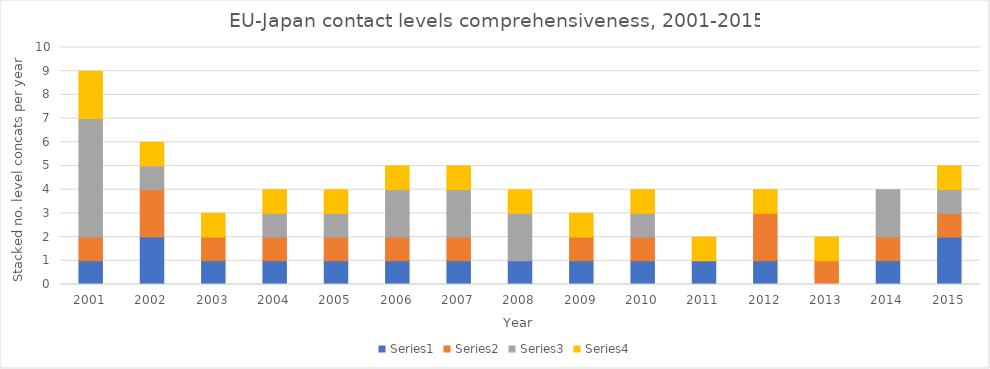
| Category | Series 0 | Series 1 | Series 2 | Series 3 |
|---|---|---|---|---|
| 2001.0 | 1 | 1 | 5 | 2 |
| 2002.0 | 2 | 2 | 1 | 1 |
| 2003.0 | 1 | 1 | 0 | 1 |
| 2004.0 | 1 | 1 | 1 | 1 |
| 2005.0 | 1 | 1 | 1 | 1 |
| 2006.0 | 1 | 1 | 2 | 1 |
| 2007.0 | 1 | 1 | 2 | 1 |
| 2008.0 | 1 | 0 | 2 | 1 |
| 2009.0 | 1 | 1 | 0 | 1 |
| 2010.0 | 1 | 1 | 1 | 1 |
| 2011.0 | 1 | 0 | 0 | 1 |
| 2012.0 | 1 | 2 | 0 | 1 |
| 2013.0 | 0 | 1 | 0 | 1 |
| 2014.0 | 1 | 1 | 2 | 0 |
| 2015.0 | 2 | 1 | 1 | 1 |